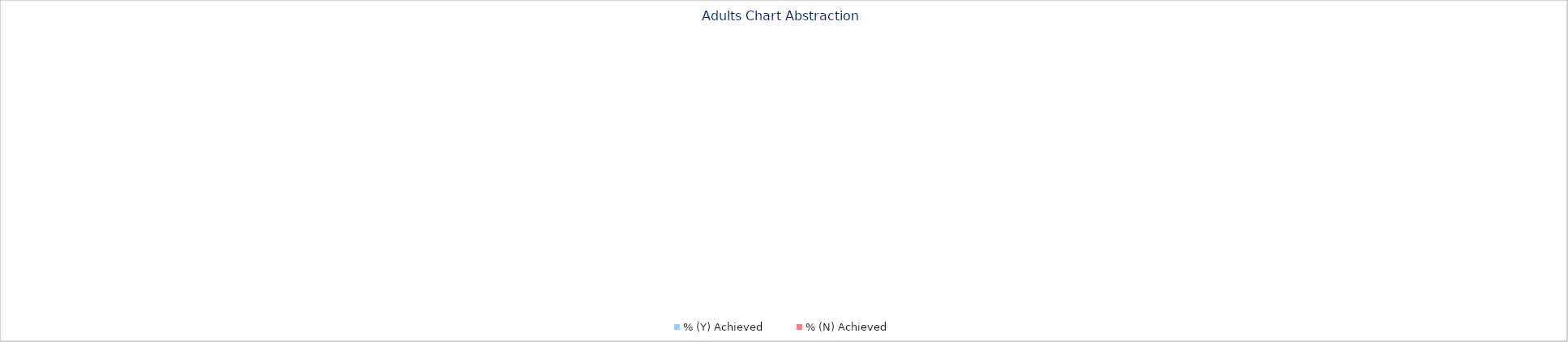
| Category | % (Y) Achieved | % (N) Achieved |
|---|---|---|
| 0 | 0 | 1 |
| 1 | 0 | 1 |
| 2 | 0 | 1 |
| 3 | 0 | 1 |
| 4 | 0 | 1 |
| 5 | 0 | 1 |
| 6 | 0 | 1 |
| 7 | 0 | 1 |
| 8 | 0 | 1 |
| 9 | 0 | 1 |
| 10 | 0 | 1 |
| 11 | 0 | 1 |
| 12 | 0 | 1 |
| 13 | 0 | 1 |
| 14 | 0 | 1 |
| 15 | 0 | 1 |
| 16 | 0 | 1 |
| 17 | 0 | 1 |
| 18 | 0 | 1 |
| 19 | 0 | 1 |
| 20 | 0 | 1 |